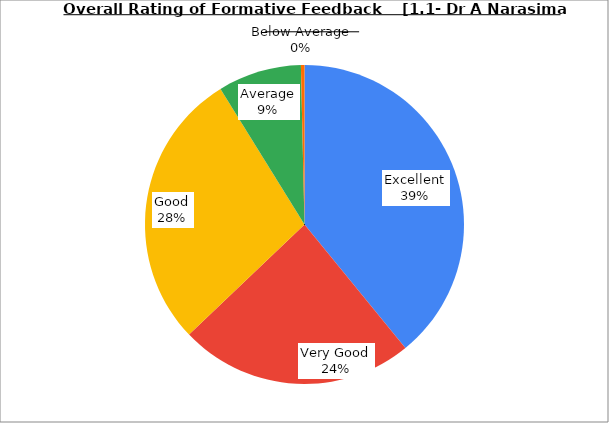
| Category | Series 0 |
|---|---|
| Excellent | 39.099 |
| Very Good | 23.784 |
| Good | 28.288 |
| Average | 8.468 |
| Below Average | 0.36 |